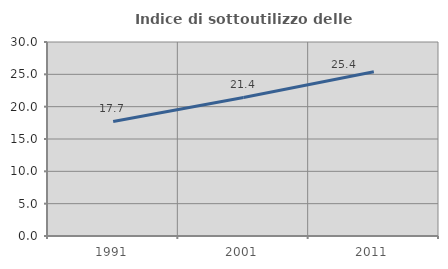
| Category | Indice di sottoutilizzo delle abitazioni  |
|---|---|
| 1991.0 | 17.711 |
| 2001.0 | 21.42 |
| 2011.0 | 25.391 |